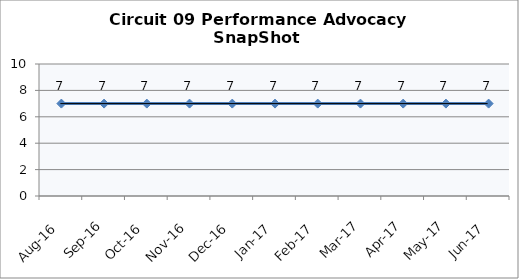
| Category | Circuit 09 |
|---|---|
| Aug-16 | 7 |
| Sep-16 | 7 |
| Oct-16 | 7 |
| Nov-16 | 7 |
| Dec-16 | 7 |
| Jan-17 | 7 |
| Feb-17 | 7 |
| Mar-17 | 7 |
| Apr-17 | 7 |
| May-17 | 7 |
| Jun-17 | 7 |